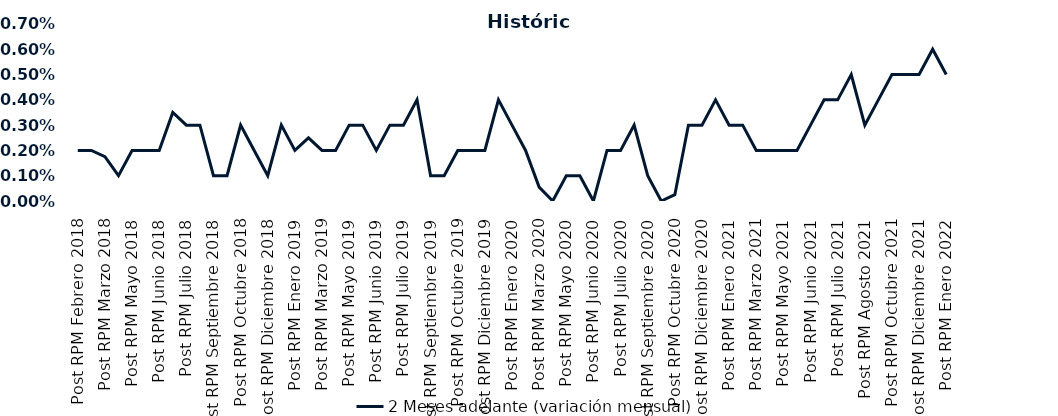
| Category | 2 Meses adelante (variación mensual) |
|---|---|
| Post RPM Febrero 2018 | 0.002 |
| Pre RPM Marzo 2018 | 0.002 |
| Post RPM Marzo 2018 | 0.002 |
| Pre RPM Mayo 2018 | 0.001 |
| Post RPM Mayo 2018 | 0.002 |
| Pre RPM Junio 2018 | 0.002 |
| Post RPM Junio 2018 | 0.002 |
| Pre RPM Julio 2018 | 0.004 |
| Post RPM Julio 2018 | 0.003 |
| Pre RPM Septiembre 2018 | 0.003 |
| Post RPM Septiembre 2018 | 0.001 |
| Pre RPM Octubre 2018 | 0.001 |
| Post RPM Octubre 2018 | 0.003 |
| Pre RPM Diciembre 2018 | 0.002 |
| Post RPM Diciembre 2018 | 0.001 |
| Pre RPM Enero 2019 | 0.003 |
| Post RPM Enero 2019 | 0.002 |
| Pre RPM Marzo 2019 | 0.002 |
| Post RPM Marzo 2019 | 0.002 |
| Pre RPM Mayo 2019 | 0.002 |
| Post RPM Mayo 2019 | 0.003 |
| Pre RPM Junio 2019 | 0.003 |
| Post RPM Junio 2019 | 0.002 |
| Pre RPM Julio 2019 | 0.003 |
| Post RPM Julio 2019 | 0.003 |
| Pre RPM Septiembre 2019 | 0.004 |
| Post RPM Septiembre 2019 | 0.001 |
| Pre RPM Octubre 2019 | 0.001 |
| Post RPM Octubre 2019 | 0.002 |
| Pre RPM Diciembre 2019 | 0.002 |
| Post RPM Diciembre 2019 | 0.002 |
| Pre RPM Enero 2020 | 0.004 |
| Post RPM Enero 2020 | 0.003 |
| Pre RPM Marzo 2020 | 0.002 |
| Post RPM Marzo 2020 | 0.001 |
| Pre RPM Mayo 2020 | 0 |
| Post RPM Mayo 2020 | 0.001 |
| Pre RPM Junio 2020 | 0.001 |
| Post RPM Junio 2020 | 0 |
| Pre RPM Julio 2020 | 0.002 |
| Post RPM Julio 2020 | 0.002 |
| Pre RPM Septiembre 2020 | 0.003 |
| Post RPM Septiembre 2020 | 0.001 |
| Pre RPM Octubre 2020 | 0 |
| Post RPM Octubre 2020 | 0 |
| Pre RPM Diciembre 2020 | 0.003 |
| Post RPM Diciembre 2020 | 0.003 |
| Pre RPM Enero 2021 | 0.004 |
| Post RPM Enero 2021 | 0.003 |
| Pre RPM Marzo 2021 | 0.003 |
| Post RPM Marzo 2021 | 0.002 |
| Pre RPM Mayo 2021 | 0.002 |
| Post RPM Mayo 2021 | 0.002 |
| Pre RPM Junio 2021 | 0.002 |
| Post RPM Junio 2021 | 0.003 |
| Pre RPM Julio 2021 | 0.004 |
| Post RPM Julio 2021 | 0.004 |
| Pre RPM Agosto 2021 | 0.005 |
| Post RPM Agosto 2021 | 0.003 |
| Pre RPM Octubre 2021 | 0.004 |
| Post RPM Octubre 2021 | 0.005 |
| Pre RPM Diciembre 2021 | 0.005 |
| Post RPM Diciembre 2021 | 0.005 |
| Pre RPM Enero 2022 | 0.006 |
| Post RPM Enero 2022 | 0.005 |